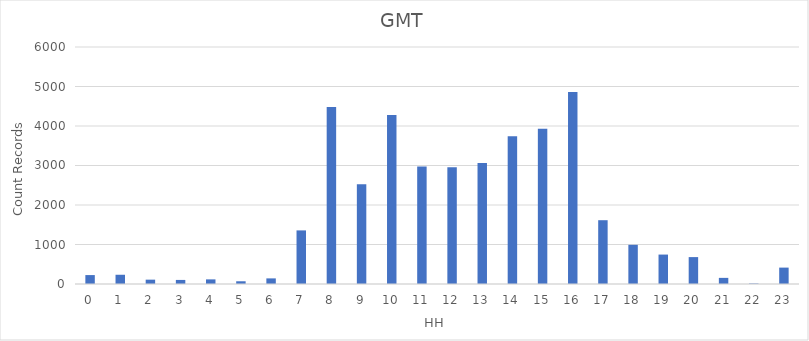
| Category | 43554 |
|---|---|
| 0.0 | 226 |
| 1.0 | 234 |
| 2.0 | 110 |
| 3.0 | 103 |
| 4.0 | 117 |
| 5.0 | 69 |
| 6.0 | 142 |
| 7.0 | 1357 |
| 8.0 | 4482 |
| 9.0 | 2524 |
| 10.0 | 4281 |
| 11.0 | 2977 |
| 12.0 | 2958 |
| 13.0 | 3061 |
| 14.0 | 3740 |
| 15.0 | 3929 |
| 16.0 | 4863 |
| 17.0 | 1615 |
| 18.0 | 992 |
| 19.0 | 745 |
| 20.0 | 681 |
| 21.0 | 155 |
| 22.0 | 12 |
| 23.0 | 415 |